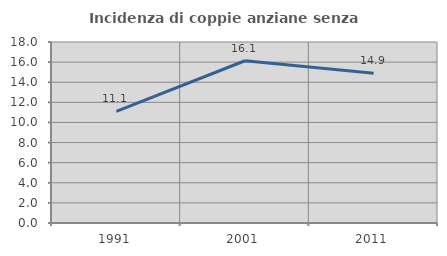
| Category | Incidenza di coppie anziane senza figli  |
|---|---|
| 1991.0 | 11.111 |
| 2001.0 | 16.136 |
| 2011.0 | 14.889 |